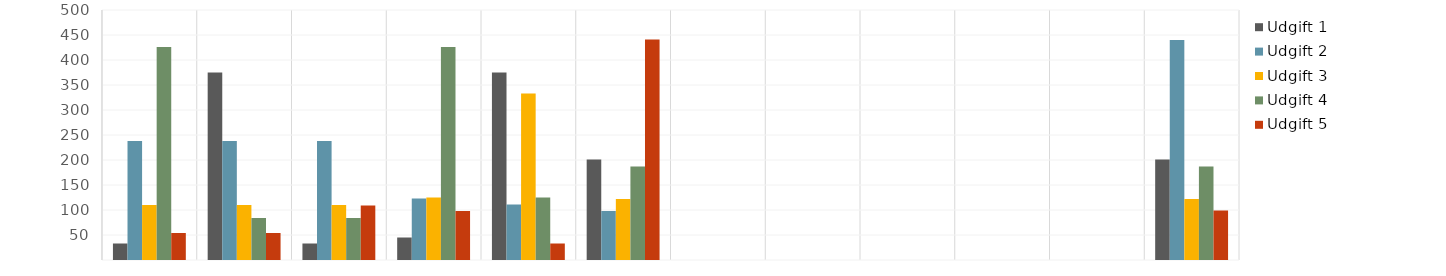
| Category | Udgift 1 | Udgift 2 | Udgift 3 | Udgift 4 | Udgift 5 |
|---|---|---|---|---|---|
| Jan | 33 | 238 | 110 | 426 | 54 |
| Feb | 375 | 238 | 110 | 84 | 54 |
| Mar | 33 | 238 | 110 | 84 | 109 |
| Apr | 45 | 123 | 125 | 426 | 98 |
| Maj | 375 | 111 | 333 | 125 | 33 |
| Jun | 201 | 98 | 122 | 187 | 441 |
| Jul | 0 | 0 | 0 | 0 | 0 |
| Aug | 0 | 0 | 0 | 0 | 0 |
| Sep | 0 | 0 | 0 | 0 | 0 |
| Okt | 0 | 0 | 0 | 0 | 0 |
| Nov | 0 | 0 | 0 | 0 | 0 |
| Dec | 201 | 440 | 122 | 187 | 99 |